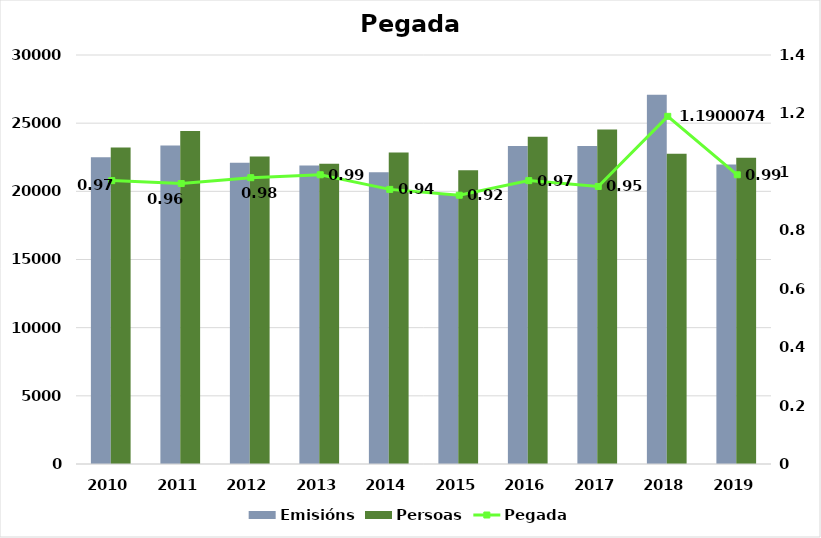
| Category | Emisións | Persoas |
|---|---|---|
| 2010.0 | 22496 | 23219 |
| 2011.0 | 23371 | 24429 |
| 2012.0 | 22096 | 22564 |
| 2013.0 | 21886 | 22026 |
| 2014.0 | 21397 | 22848 |
| 2015.0 | 19749 | 21549 |
| 2016.0 | 23330 | 24001 |
| 2017.0 | 23332 | 24529 |
| 2018.0 | 27081 | 22757 |
| 2019.0 | 21976 | 22467 |